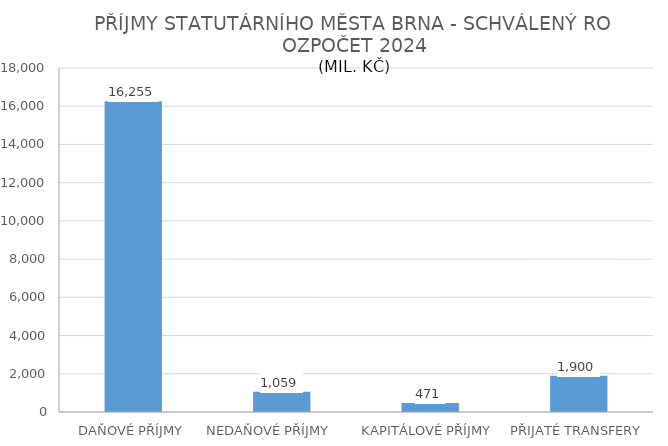
| Category | Series 0 |
|---|---|
| DAŇOVÉ PŘÍJMY | 16255.358 |
| NEDAŇOVÉ PŘÍJMY              | 1058.822 |
| KAPITÁLOVÉ PŘÍJMY  | 471.15 |
| PŘIJATÉ TRANSFERY | 1900.475 |